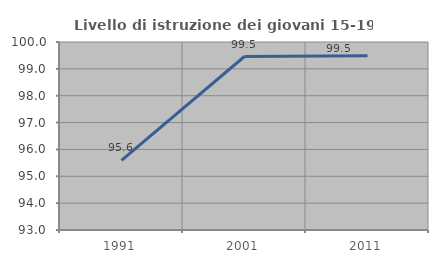
| Category | Livello di istruzione dei giovani 15-19 anni |
|---|---|
| 1991.0 | 95.595 |
| 2001.0 | 99.459 |
| 2011.0 | 99.49 |